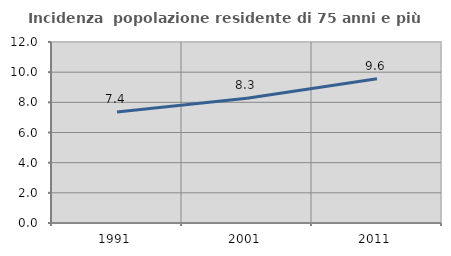
| Category | Incidenza  popolazione residente di 75 anni e più |
|---|---|
| 1991.0 | 7.355 |
| 2001.0 | 8.266 |
| 2011.0 | 9.563 |